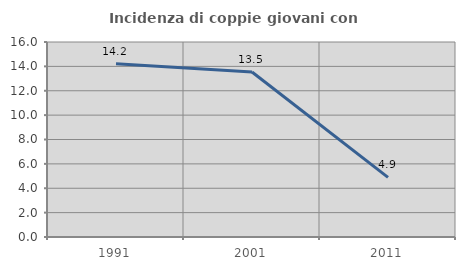
| Category | Incidenza di coppie giovani con figli |
|---|---|
| 1991.0 | 14.209 |
| 2001.0 | 13.535 |
| 2011.0 | 4.895 |